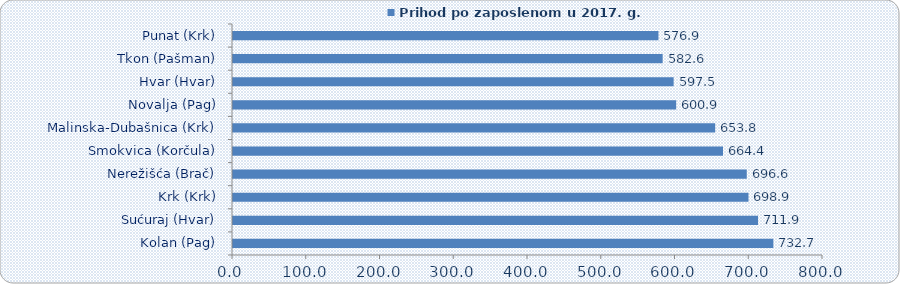
| Category | Prihod po zaposlenom u 2017. g. |
|---|---|
| Kolan (Pag) | 732.673 |
| Sućuraj (Hvar) | 711.884 |
| Krk (Krk) | 698.947 |
| Nerežišća (Brač) | 696.628 |
| Smokvica (Korčula) | 664.432 |
| Malinska-Dubašnica (Krk) | 653.755 |
| Novalja (Pag) | 600.88 |
| Hvar (Hvar) | 597.478 |
| Tkon (Pašman) | 582.585 |
| Punat (Krk) | 576.854 |